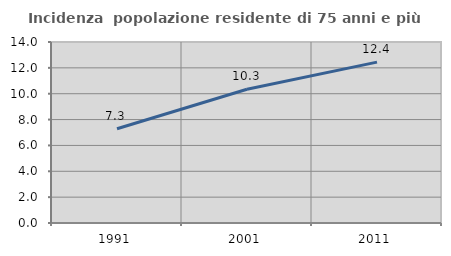
| Category | Incidenza  popolazione residente di 75 anni e più |
|---|---|
| 1991.0 | 7.292 |
| 2001.0 | 10.345 |
| 2011.0 | 12.443 |